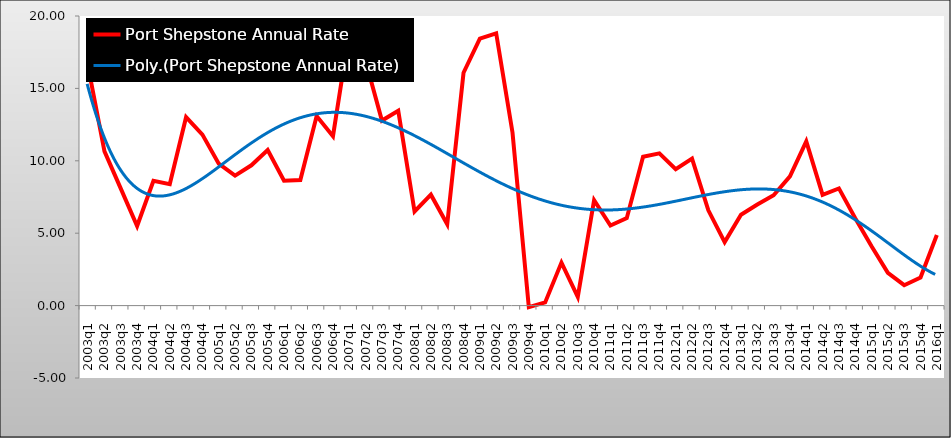
| Category | Port Shepstone Annual Rate |
|---|---|
| 2003q1 | 16.484 |
| 2003q2 | 10.653 |
| 2003q3 | 8.077 |
| 2003q4 | 5.498 |
| 2004q1 | 8.622 |
| 2004q2 | 8.384 |
| 2004q3 | 13.013 |
| 2004q4 | 11.807 |
| 2005q1 | 9.8 |
| 2005q2 | 8.977 |
| 2005q3 | 9.688 |
| 2005q4 | 10.745 |
| 2006q1 | 8.628 |
| 2006q2 | 8.672 |
| 2006q3 | 13.091 |
| 2006q4 | 11.701 |
| 2007q1 | 18.906 |
| 2007q2 | 16.896 |
| 2007q3 | 12.778 |
| 2007q4 | 13.461 |
| 2008q1 | 6.501 |
| 2008q2 | 7.66 |
| 2008q3 | 5.614 |
| 2008q4 | 16.081 |
| 2009q1 | 18.435 |
| 2009q2 | 18.808 |
| 2009q3 | 11.952 |
| 2009q4 | -0.107 |
| 2010q1 | 0.22 |
| 2010q2 | 2.97 |
| 2010q3 | 0.606 |
| 2010q4 | 7.287 |
| 2011q1 | 5.529 |
| 2011q2 | 6.037 |
| 2011q3 | 10.283 |
| 2011q4 | 10.511 |
| 2012q1 | 9.424 |
| 2012q2 | 10.148 |
| 2012q3 | 6.581 |
| 2012q4 | 4.383 |
| 2013q1 | 6.273 |
| 2013q2 | 6.981 |
| 2013q3 | 7.622 |
| 2013q4 | 8.921 |
| 2014q1 | 11.346 |
| 2014q2 | 7.653 |
| 2014q3 | 8.094 |
| 2014q4 | 6.036 |
| 2015q1 | 4.092 |
| 2015q2 | 2.264 |
| 2015q3 | 1.409 |
| 2015q4 | 1.943 |
| 2016q1 | 4.877 |